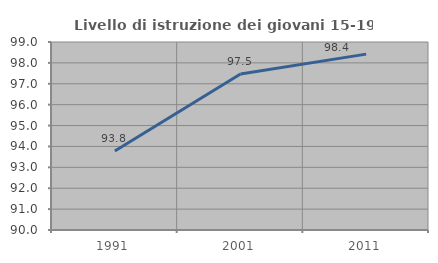
| Category | Livello di istruzione dei giovani 15-19 anni |
|---|---|
| 1991.0 | 93.779 |
| 2001.0 | 97.469 |
| 2011.0 | 98.42 |